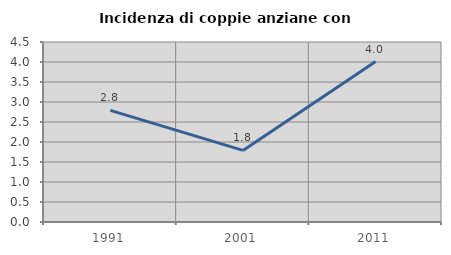
| Category | Incidenza di coppie anziane con figli |
|---|---|
| 1991.0 | 2.791 |
| 2001.0 | 1.79 |
| 2011.0 | 4.011 |